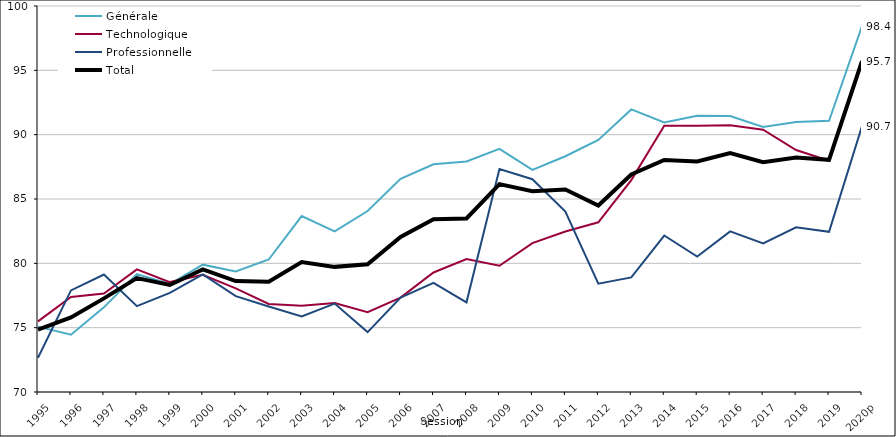
| Category | Générale | Technologique | Professionnelle | Total |
|---|---|---|---|---|
| 1995 | 75.082 | 75.492 | 72.657 | 74.856 |
| 1996 | 74.45 | 77.383 | 77.895 | 75.798 |
| 1997 | 76.578 | 77.654 | 79.127 | 77.277 |
| 1998 | 79.164 | 79.529 | 76.669 | 78.851 |
| 1999 | 78.39 | 78.542 | 77.705 | 78.314 |
| 2000 | 79.897 | 79.116 | 79.147 | 79.53 |
| 2001 | 79.369 | 78.056 | 77.454 | 78.617 |
| 2002 | 80.297 | 76.838 | 76.645 | 78.57 |
| 2003 | 83.669 | 76.703 | 75.876 | 80.104 |
| 2004 | 82.477 | 76.92 | 76.873 | 79.725 |
| 2005 | 84.065 | 76.211 | 74.657 | 79.921 |
| 2006 | 86.566 | 77.333 | 77.333 | 82.056 |
| 2007 | 87.704 | 79.291 | 78.487 | 83.419 |
| 2008 | 87.917 | 80.33 | 76.969 | 83.488 |
| 2009 | 88.898 | 79.81 | 87.33 | 86.156 |
| 2010 | 87.259 | 81.567 | 86.538 | 85.601 |
| 2011 | 88.324 | 82.478 | 84.017 | 85.74 |
| 2012 | 89.595 | 83.189 | 78.423 | 84.492 |
| 2013 | 91.964 | 86.466 | 78.908 | 86.909 |
| 2014 | 90.953 | 90.702 | 82.162 | 88.031 |
| 2015 | 91.477 | 90.699 | 80.522 | 87.91 |
| 2016 | 91.452 | 90.724 | 82.48 | 88.575 |
| 2017 | 90.592 | 90.385 | 81.546 | 87.863 |
| 2018 | 90.979 | 88.808 | 82.806 | 88.233 |
| 2019 | 91.084 | 87.969 | 82.45 | 88.043 |
| 2020p | 98.438 | 95.653 | 90.659 | 95.717 |